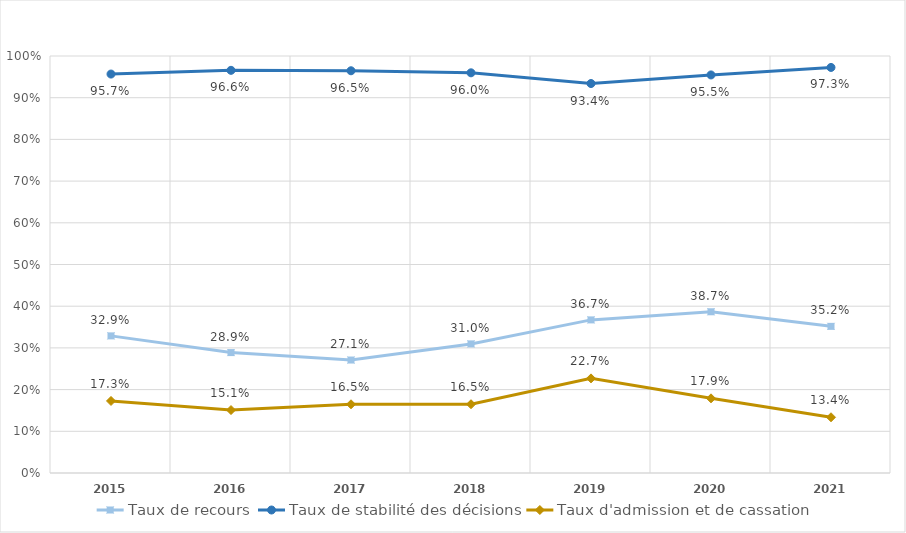
| Category | Taux de recours | Taux de stabilité des décisions | Taux d'admission et de cassation |
|---|---|---|---|
| 2015.0 | 0.329 | 0.957 | 0.173 |
| 2016.0 | 0.289 | 0.966 | 0.151 |
| 2017.0 | 0.271 | 0.965 | 0.165 |
| 2018.0 | 0.31 | 0.96 | 0.165 |
| 2019.0 | 0.367 | 0.934 | 0.227 |
| 2020.0 | 0.387 | 0.955 | 0.179 |
| 2021.0 | 0.352 | 0.973 | 0.134 |